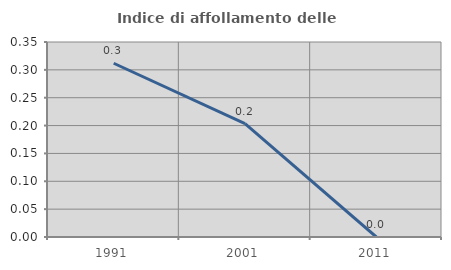
| Category | Indice di affollamento delle abitazioni  |
|---|---|
| 1991.0 | 0.312 |
| 2001.0 | 0.204 |
| 2011.0 | 0 |